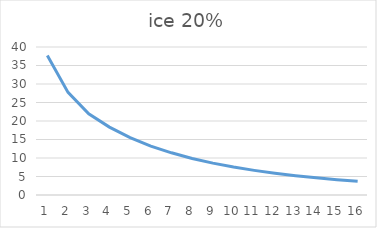
| Category | Series 0 |
|---|---|
| 0 | 37.7 |
| 1 | 27.74 |
| 2 | 21.94 |
| 3 | 18.347 |
| 4 | 15.504 |
| 5 | 13.223 |
| 6 | 11.4 |
| 7 | 9.875 |
| 8 | 8.619 |
| 9 | 7.543 |
| 10 | 6.654 |
| 11 | 5.879 |
| 12 | 5.22 |
| 13 | 4.649 |
| 14 | 4.138 |
| 15 | 3.693 |